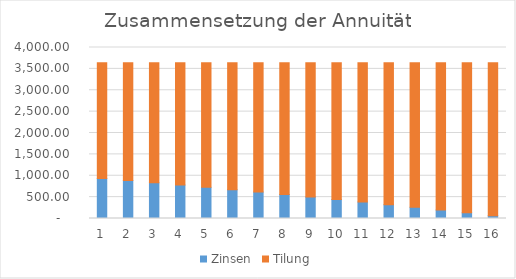
| Category | Zinsen | Tilung |
|---|---|---|
| 0 | 937.5 | 2708.643 |
| 1 | 886.713 | 2759.43 |
| 2 | 834.974 | 2811.169 |
| 3 | 782.264 | 2863.878 |
| 4 | 728.567 | 2917.576 |
| 5 | 673.862 | 2972.281 |
| 6 | 618.132 | 3028.011 |
| 7 | 561.356 | 3084.786 |
| 8 | 503.517 | 3142.626 |
| 9 | 444.593 | 3201.55 |
| 10 | 384.563 | 3261.579 |
| 11 | 323.409 | 3322.734 |
| 12 | 261.108 | 3385.035 |
| 13 | 197.638 | 3448.504 |
| 14 | 132.979 | 3513.164 |
| 15 | 67.107 | 3579.036 |